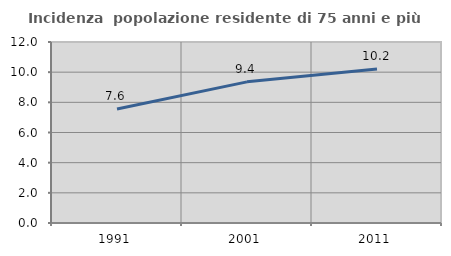
| Category | Incidenza  popolazione residente di 75 anni e più |
|---|---|
| 1991.0 | 7.557 |
| 2001.0 | 9.358 |
| 2011.0 | 10.202 |